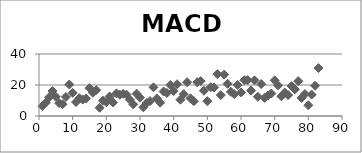
| Category | MACD |
|---|---|
| 1.0 | 6.4 |
| 2.0 | 8.6 |
| 3.0 | 12.1 |
| 4.0 | 16.1 |
| 5.0 | 12.4 |
| 6.0 | 8.3 |
| 7.0 | 7.6 |
| 8.0 | 12.3 |
| 9.0 | 20.3 |
| 10.0 | 14.9 |
| 11.0 | 9 |
| 12.0 | 11.5 |
| 13.0 | 10.6 |
| 14.0 | 11.3 |
| 15.0 | 18 |
| 16.0 | 15 |
| 17.0 | 16.7 |
| 18.0 | 5.3 |
| 19.0 | 9.9 |
| 20.0 | 8.9 |
| 21.0 | 12.6 |
| 22.0 | 8.7 |
| 23.0 | 14.6 |
| 24.0 | 13.7 |
| 25.0 | 14.3 |
| 26.0 | 13.8 |
| 27.0 | 10.5 |
| 28.0 | 7.5 |
| 29.0 | 14.4 |
| 30.0 | 11.8 |
| 31.0 | 5.6 |
| 32.0 | 8.4 |
| 33.0 | 9.6 |
| 34.0 | 18.5 |
| 35.0 | 11.3 |
| 36.0 | 8.6 |
| 37.0 | 15.8 |
| 38.0 | 14.8 |
| 39.0 | 20 |
| 40.0 | 16.1 |
| 41.0 | 20.5 |
| 42.0 | 10.5 |
| 43.0 | 14.1 |
| 44.0 | 21.8 |
| 45.0 | 11.4 |
| 46.0 | 9.5 |
| 47.0 | 21.8 |
| 48.0 | 22.5 |
| 49.0 | 16.3 |
| 50.0 | 9.6 |
| 51.0 | 18.6 |
| 52.0 | 18.4 |
| 53.0 | 27 |
| 54.0 | 13.5 |
| 55.0 | 26.7 |
| 56.0 | 20.8 |
| 57.0 | 15.6 |
| 58.0 | 14.1 |
| 59.0 | 20 |
| 60.0 | 15.2 |
| 61.0 | 23.1 |
| 62.0 | 23.2 |
| 63.0 | 16.4 |
| 64.0 | 23 |
| 65.0 | 12.4 |
| 66.0 | 20.6 |
| 67.0 | 11.7 |
| 68.0 | 13.2 |
| 69.0 | 14.5 |
| 70.0 | 23 |
| 71.0 | 19.8 |
| 72.0 | 12.7 |
| 73.0 | 15.1 |
| 74.0 | 13.5 |
| 75.0 | 19.3 |
| 76.0 | 17.2 |
| 77.0 | 22.5 |
| 78.0 | 11.6 |
| 79.0 | 14.2 |
| 80.0 | 6.9 |
| 81.0 | 13.8 |
| 82.0 | 19.5 |
| 83.0 | 30.9 |